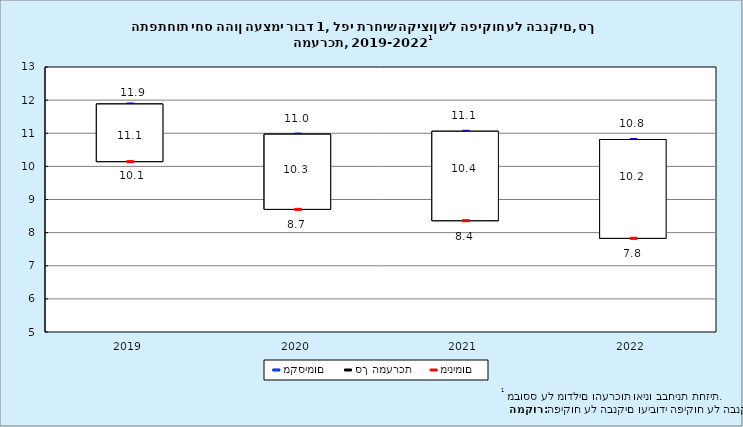
| Category | מקסימום | סך המערכת | מינימום |
|---|---|---|---|
| 2019-12-31 | 11.882 | 11.147 | 10.144 |
| 2020-12-31 | 10.972 | 10.262 | 8.703 |
| 2021-12-31 | 11.059 | 10.402 | 8.361 |
| 2022-12-31 | 10.812 | 10.165 | 7.829 |